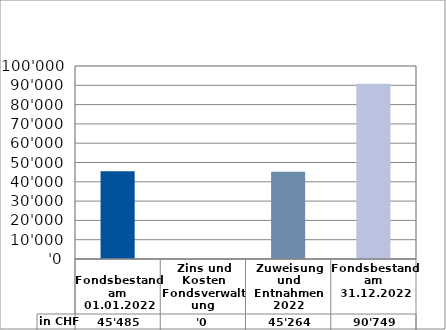
| Category | in CHF |
|---|---|
| 
Fondsbestand am 01.01.2022

 | 45484.85 |
| Zins und Kosten Fondsverwaltung | 0 |
| Zuweisung und Entnahmen 2022 | 45264.2 |
| Fondsbestand am 31.12.2022 | 90749.05 |